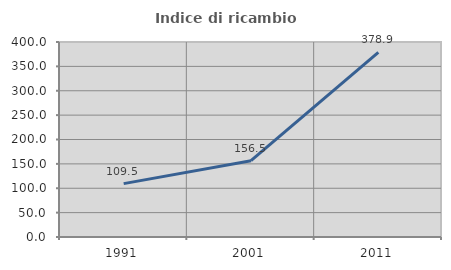
| Category | Indice di ricambio occupazionale  |
|---|---|
| 1991.0 | 109.524 |
| 2001.0 | 156.459 |
| 2011.0 | 378.892 |